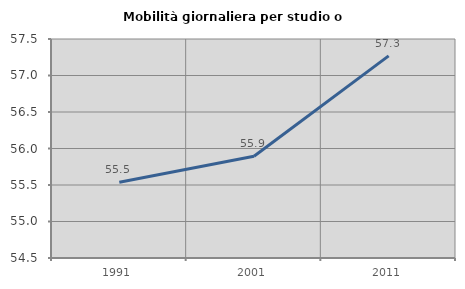
| Category | Mobilità giornaliera per studio o lavoro |
|---|---|
| 1991.0 | 55.538 |
| 2001.0 | 55.893 |
| 2011.0 | 57.268 |